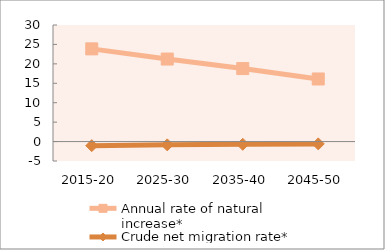
| Category | Annual rate of natural increase* | Crude net migration rate* |
|---|---|---|
| 2015-20 | 23.856 | -1.055 |
| 2025-30 | 21.241 | -0.85 |
| 2035-40 | 18.789 | -0.701 |
| 2045-50 | 16.109 | -0.593 |